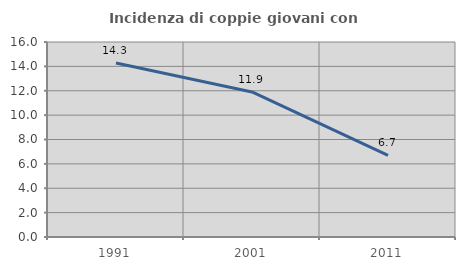
| Category | Incidenza di coppie giovani con figli |
|---|---|
| 1991.0 | 14.27 |
| 2001.0 | 11.902 |
| 2011.0 | 6.704 |